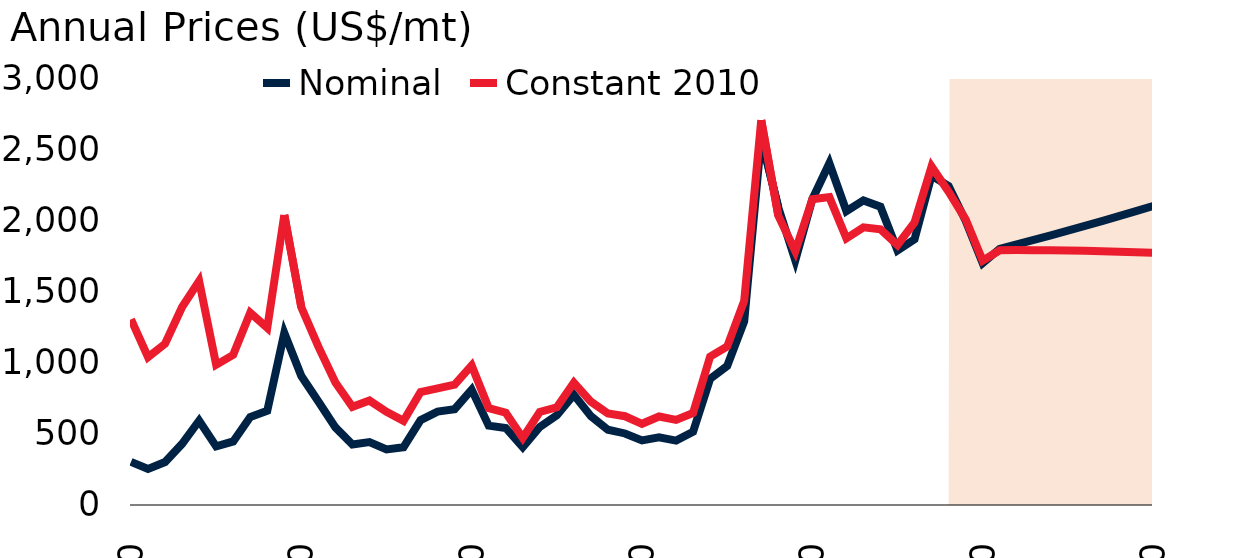
| Category | Nominal | Constant 2010 |
|---|---|---|
| 1970.0 | 302.908 | 1304.818 |
| 1971.0 | 253.625 | 1038.823 |
| 1972.0 | 301.658 | 1132.663 |
| 1973.0 | 429.683 | 1391.164 |
| 1974.0 | 592.258 | 1573.484 |
| 1975.0 | 411.675 | 984.801 |
| 1976.0 | 446.417 | 1054.96 |
| 1977.0 | 618 | 1351.047 |
| 1978.0 | 661.917 | 1245.194 |
| 1979.0 | 1208.25 | 2037.568 |
| 1980.0 | 905.75 | 1388.668 |
| 1981.0 | 726.725 | 1112.922 |
| 1982.0 | 545.6 | 861.193 |
| 1983.0 | 425.342 | 689.663 |
| 1984.0 | 442.608 | 733.809 |
| 1985.0 | 390.858 | 654.84 |
| 1986.0 | 406.075 | 591.509 |
| 1987.0 | 596.842 | 793.354 |
| 1988.0 | 656.225 | 819.123 |
| 1989.0 | 673.475 | 845.722 |
| 1990.0 | 810.542 | 980.426 |
| 1991.0 | 557.617 | 680.75 |
| 1992.0 | 541.367 | 648.785 |
| 1993.0 | 406.358 | 470.744 |
| 1994.0 | 547.767 | 654.207 |
| 1995.0 | 630.95 | 686.412 |
| 1996.0 | 774.325 | 858.752 |
| 1997.0 | 624.175 | 726.443 |
| 1998.0 | 528.642 | 643.344 |
| 1999.0 | 502.617 | 623.661 |
| 2000.0 | 453.942 | 570.568 |
| 2001.0 | 476.158 | 621.804 |
| 2002.0 | 452.683 | 598.132 |
| 2003.0 | 515.029 | 646.876 |
| 2004.0 | 886.545 | 1042.674 |
| 2005.0 | 976.368 | 1113.25 |
| 2006.0 | 1289.722 | 1434.201 |
| 2007.0 | 2579.985 | 2703.545 |
| 2008.0 | 2090.663 | 2033.049 |
| 2009.0 | 1719.266 | 1782.323 |
| 2010.0 | 2148.449 | 2148.449 |
| 2011.0 | 2400.812 | 2162.977 |
| 2012.0 | 2064.638 | 1873.96 |
| 2013.0 | 2139.79 | 1950.681 |
| 2014.0 | 2095.458 | 1936.34 |
| 2015.0 | 1787.819 | 1826.953 |
| 2016.0 | 1866.653 | 1985.091 |
| 2017.0 | 2314.665 | 2378.374 |
| 2018.0 | 2240.435 | 2201.259 |
| 2019.0 | 1996.508 | 2006.984 |
| 2020.0 | 1700 | 1717.353 |
| 2021.0 | 1800 | 1789.784 |
| 2022.0 | 1831.096 | 1790.696 |
| 2023.0 | 1862.729 | 1790.565 |
| 2024.0 | 1894.908 | 1789.589 |
| 2025.0 | 1927.643 | 1787.9 |
| 2026.0 | 1960.944 | 1785.59 |
| 2027.0 | 1994.82 | 1782.729 |
| 2028.0 | 2029.281 | 1779.363 |
| 2029.0 | 2064.338 | 1775.531 |
| 2030.0 | 2100 | 1771.26 |